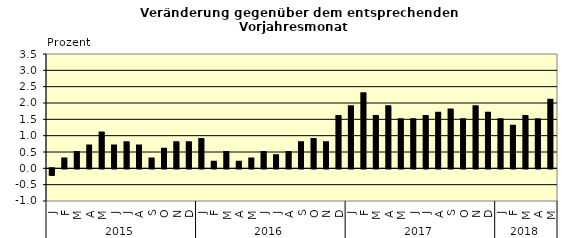
| Category | Series 0 |
|---|---|
| 0 | -0.2 |
| 1 | 0.3 |
| 2 | 0.5 |
| 3 | 0.7 |
| 4 | 1.1 |
| 5 | 0.7 |
| 6 | 0.8 |
| 7 | 0.7 |
| 8 | 0.3 |
| 9 | 0.6 |
| 10 | 0.8 |
| 11 | 0.8 |
| 12 | 0.9 |
| 13 | 0.2 |
| 14 | 0.5 |
| 15 | 0.2 |
| 16 | 0.3 |
| 17 | 0.5 |
| 18 | 0.4 |
| 19 | 0.5 |
| 20 | 0.8 |
| 21 | 0.9 |
| 22 | 0.8 |
| 23 | 1.6 |
| 24 | 1.9 |
| 25 | 2.3 |
| 26 | 1.6 |
| 27 | 1.9 |
| 28 | 1.5 |
| 29 | 1.5 |
| 30 | 1.6 |
| 31 | 1.7 |
| 32 | 1.8 |
| 33 | 1.5 |
| 34 | 1.9 |
| 35 | 1.7 |
| 36 | 1.5 |
| 37 | 1.3 |
| 38 | 1.6 |
| 39 | 1.5 |
| 40 | 2.1 |